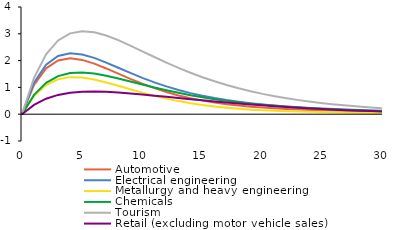
| Category | Automotive | Electrical engineering | Metallurgy and heavy engineering | Chemicals | Tourism | Retail (excluding motor vehicle sales) |
|---|---|---|---|---|---|---|
| 0.0 | 0 | 0 | 0 | 0 | 0 | 0 |
| 1.0 | 1.092 | 1.177 | 0.68 | 0.72 | 1.357 | 0.349 |
| 2.0 | 1.711 | 1.848 | 1.09 | 1.168 | 2.232 | 0.578 |
| 3.0 | 2.005 | 2.174 | 1.305 | 1.42 | 2.752 | 0.72 |
| 4.0 | 2.084 | 2.273 | 1.383 | 1.534 | 3.016 | 0.801 |
| 5.0 | 2.026 | 2.229 | 1.368 | 1.555 | 3.099 | 0.839 |
| 6.0 | 1.887 | 2.1 | 1.295 | 1.515 | 3.058 | 0.847 |
| 7.0 | 1.707 | 1.927 | 1.186 | 1.436 | 2.935 | 0.835 |
| 8.0 | 1.512 | 1.735 | 1.061 | 1.335 | 2.762 | 0.809 |
| 9.0 | 1.318 | 1.542 | 0.931 | 1.224 | 2.561 | 0.774 |
| 10.0 | 1.136 | 1.358 | 0.805 | 1.11 | 2.348 | 0.734 |
| 11.0 | 0.971 | 1.189 | 0.687 | 1 | 2.134 | 0.692 |
| 12.0 | 0.826 | 1.037 | 0.581 | 0.895 | 1.926 | 0.648 |
| 13.0 | 0.701 | 0.903 | 0.489 | 0.798 | 1.73 | 0.603 |
| 14.0 | 0.595 | 0.787 | 0.409 | 0.71 | 1.547 | 0.56 |
| 15.0 | 0.506 | 0.687 | 0.341 | 0.631 | 1.379 | 0.517 |
| 16.0 | 0.433 | 0.601 | 0.285 | 0.56 | 1.227 | 0.476 |
| 17.0 | 0.372 | 0.527 | 0.238 | 0.497 | 1.089 | 0.437 |
| 18.0 | 0.322 | 0.464 | 0.201 | 0.442 | 0.966 | 0.399 |
| 19.0 | 0.281 | 0.411 | 0.17 | 0.392 | 0.856 | 0.364 |
| 20.0 | 0.247 | 0.365 | 0.146 | 0.349 | 0.758 | 0.33 |
| 21.0 | 0.218 | 0.325 | 0.126 | 0.311 | 0.671 | 0.299 |
| 22.0 | 0.195 | 0.29 | 0.11 | 0.278 | 0.594 | 0.269 |
| 23.0 | 0.175 | 0.26 | 0.097 | 0.248 | 0.525 | 0.241 |
| 24.0 | 0.158 | 0.234 | 0.087 | 0.222 | 0.465 | 0.216 |
| 25.0 | 0.143 | 0.21 | 0.079 | 0.198 | 0.411 | 0.192 |
| 26.0 | 0.13 | 0.189 | 0.072 | 0.178 | 0.364 | 0.17 |
| 27.0 | 0.118 | 0.171 | 0.065 | 0.16 | 0.322 | 0.15 |
| 28.0 | 0.108 | 0.154 | 0.06 | 0.143 | 0.285 | 0.132 |
| 29.0 | 0.098 | 0.139 | 0.055 | 0.129 | 0.252 | 0.115 |
| 30.0 | 0.089 | 0.126 | 0.051 | 0.115 | 0.223 | 0.1 |